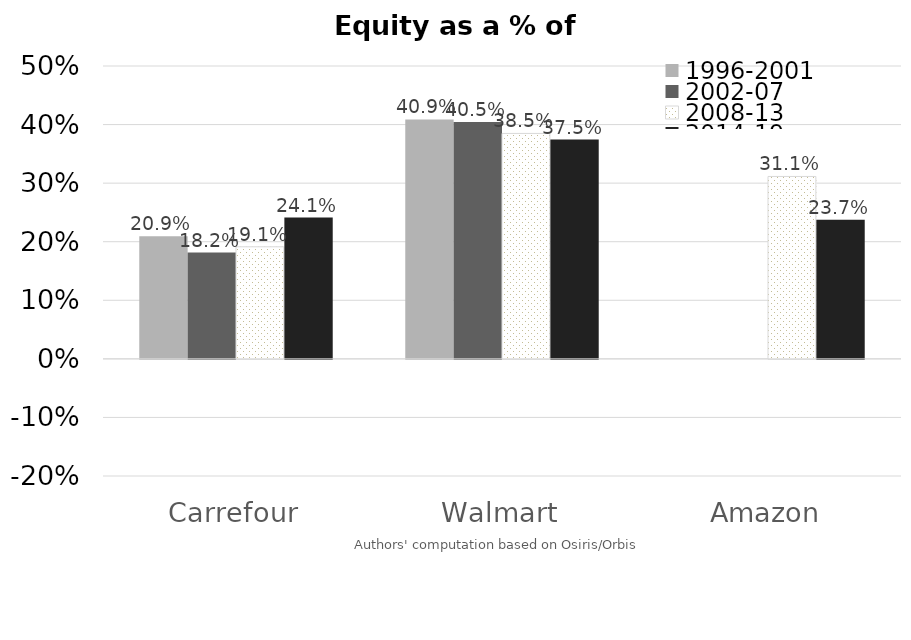
| Category | 1996-2001 | 2002-07 | 2008-13 | 2014-19 |
|---|---|---|---|---|
| Carrefour | 0.209 | 0.182 | 0.191 | 0.241 |
| Walmart | 0.409 | 0.405 | 0.385 | 0.375 |
| Amazon | -0.068 | -0.146 | 0.311 | 0.237 |